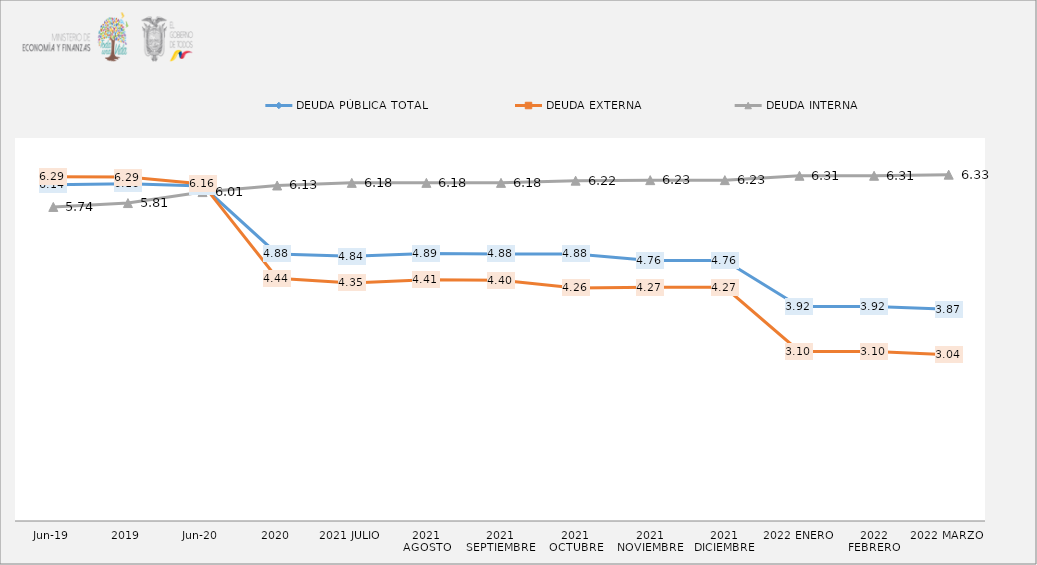
| Category | DEUDA PÚBLICA TOTAL | DEUDA EXTERNA  | DEUDA INTERNA |
|---|---|---|---|
| jun-19 | 6.143 | 6.29 | 5.74 |
| 2019 | 6.164 | 6.285 | 5.811 |
| jun-20 | 6.121 | 6.161 | 6.012 |
| 2020 | 4.881 | 4.437 | 6.132 |
| 2021 JULIO | 4.84 | 4.351 | 6.18 |
| 2021 AGOSTO | 4.89 | 4.41 | 6.18 |
| 2021 SEPTIEMBRE | 4.88 | 4.4 | 6.18 |
| 2021 OCTUBRE | 4.88 | 4.26 | 6.22 |
| 2021 NOVIEMBRE | 4.76 | 4.27 | 6.23 |
| 2021 DICIEMBRE | 4.76 | 4.27 | 6.23 |
| 2022 ENERO | 3.92 | 3.1 | 6.31 |
| 2022 FEBRERO | 3.92 | 3.1 | 6.31 |
| 2022 MARZO | 3.87 | 3.04 | 6.33 |